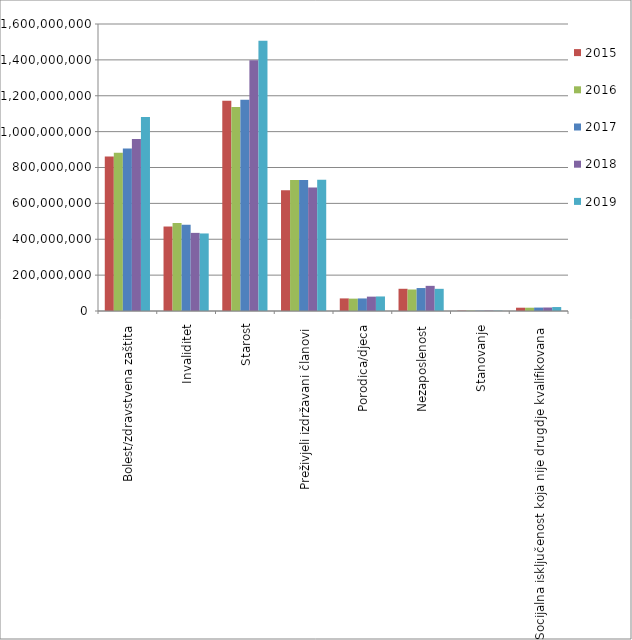
| Category | 2015 | 2016 | 2017 | 2018 | 2019 |
|---|---|---|---|---|---|
| Bolest/zdravstvena zaštita | 860956318.522 | 882054810.93 | 906390107.23 | 958694516.18 | 1081074318.63 |
| Invaliditet | 470982887.895 | 491249842.801 | 481027947.749 | 435532865.82 | 432270055.9 |
| Starost | 1171535300.929 | 1136847549.559 | 1177300241.067 | 1398523288.407 | 1507299416.41 |
| Preživjeli izdržavani članovi | 672964115.163 | 730471758.126 | 730906075.024 | 688781840.163 | 731175689.19 |
| Porodica/djeca | 70236091.19 | 68899021.66 | 70020855.4 | 80053503.71 | 81068770.6 |
| Nezaposlenost | 123852597.6 | 119832343.831 | 127981130.14 | 140233627.884 | 123650938.24 |
| Stanovanje | 1914673.3 | 1848872.98 | 1603832.85 | 2179950.21 | 1841959.22 |
| Socijalna isključenost koja nije drugdje kvalifikovana | 18381358.43 | 18328724.48 | 19067104.75 | 19485179.98 | 22122970.22 |